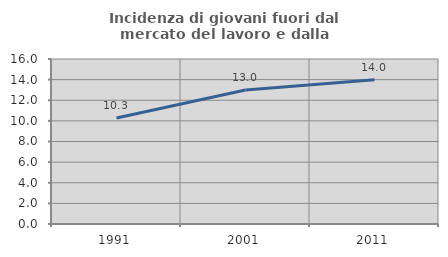
| Category | Incidenza di giovani fuori dal mercato del lavoro e dalla formazione  |
|---|---|
| 1991.0 | 10.275 |
| 2001.0 | 13 |
| 2011.0 | 13.978 |